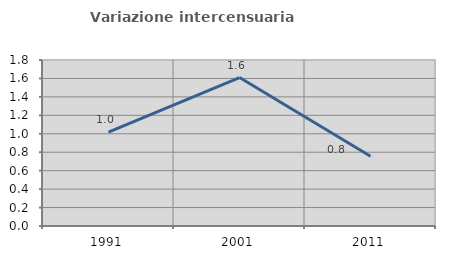
| Category | Variazione intercensuaria annua |
|---|---|
| 1991.0 | 1.019 |
| 2001.0 | 1.61 |
| 2011.0 | 0.757 |